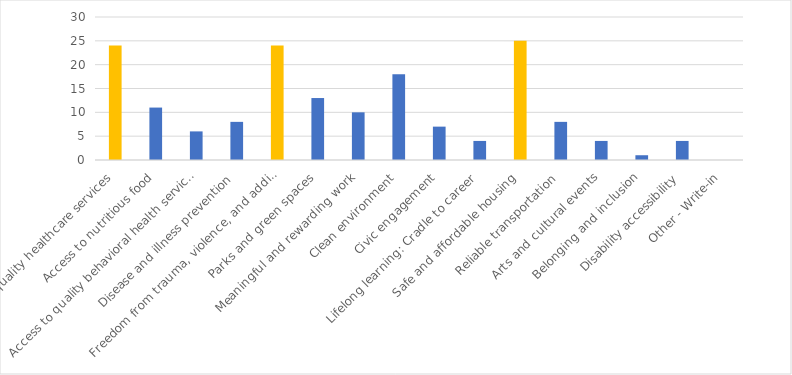
| Category | Number of Responses |
|---|---|
| Access to quality healthcare services | 24 |
| Access to nutritious food | 11 |
| Access to quality behavioral health services | 6 |
| Disease and illness prevention | 8 |
| Freedom from trauma, violence, and addiction | 24 |
| Parks and green spaces | 13 |
| Meaningful and rewarding work | 10 |
| Clean environment | 18 |
| Civic engagement | 7 |
| Lifelong learning: Cradle to career | 4 |
| Safe and affordable housing | 25 |
| Reliable transportation | 8 |
| Arts and cultural events | 4 |
| Belonging and inclusion | 1 |
| Disability accessibility | 4 |
| Other - Write-in | 0 |